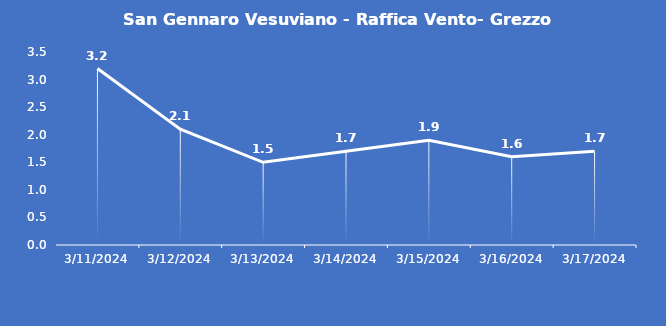
| Category | San Gennaro Vesuviano - Raffica Vento- Grezzo (m/s) |
|---|---|
| 3/11/24 | 3.2 |
| 3/12/24 | 2.1 |
| 3/13/24 | 1.5 |
| 3/14/24 | 1.7 |
| 3/15/24 | 1.9 |
| 3/16/24 | 1.6 |
| 3/17/24 | 1.7 |